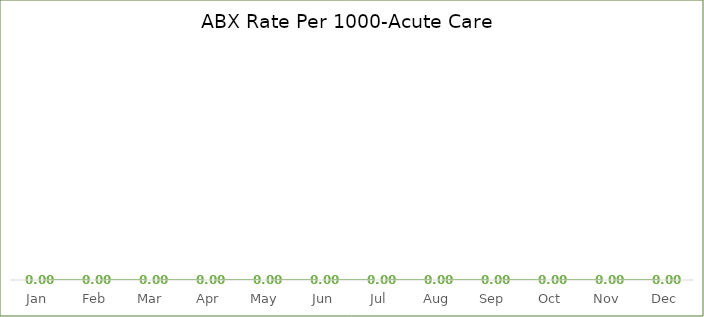
| Category | Rate Per 1000 |
|---|---|
| Jan | 0 |
| Feb | 0 |
| Mar | 0 |
| Apr | 0 |
| May | 0 |
| Jun | 0 |
| Jul | 0 |
| Aug | 0 |
| Sep | 0 |
| Oct | 0 |
| Nov | 0 |
| Dec | 0 |